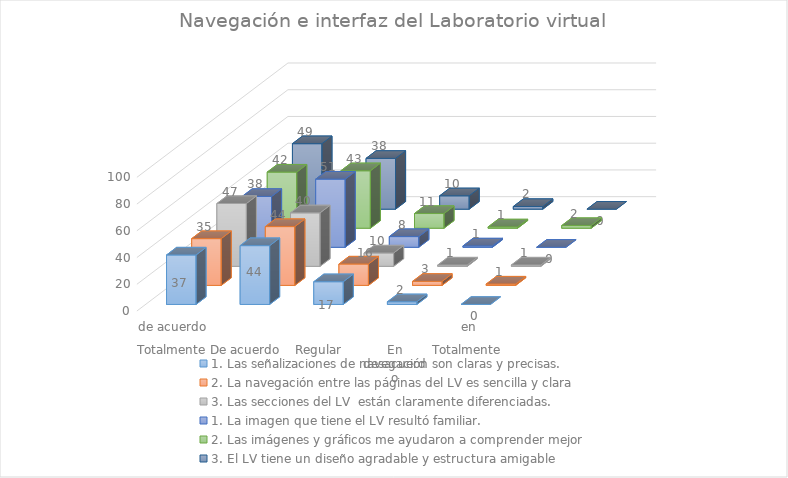
| Category | 1. Las señalizaciones de navegación son claras y precisas. | 2. La navegación entre las páginas del LV es sencilla y clara | 3. Las secciones del LV  están claramente diferenciadas. | 1. La imagen que tiene el LV resultó familiar. | 2. Las imágenes y gráficos me ayudaron a comprender mejor | 3. El LV tiene un diseño agradable y estructura amigable |
|---|---|---|---|---|---|---|
| 0 | 37 | 35 | 47 | 38 | 42 | 49 |
| 1 | 44 | 44 | 40 | 51 | 43 | 38 |
| 2 | 17 | 16 | 10 | 8 | 11 | 10 |
| 3 | 2 | 3 | 1 | 1 | 1 | 2 |
| 4 | 0 | 1 | 1 | 0 | 2 | 0 |